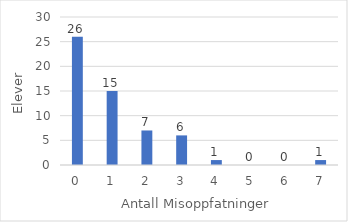
| Category | Series 0 |
|---|---|
| 0.0 | 26 |
| 1.0 | 15 |
| 2.0 | 7 |
| 3.0 | 6 |
| 4.0 | 1 |
| 5.0 | 0 |
| 6.0 | 0 |
| 7.0 | 1 |